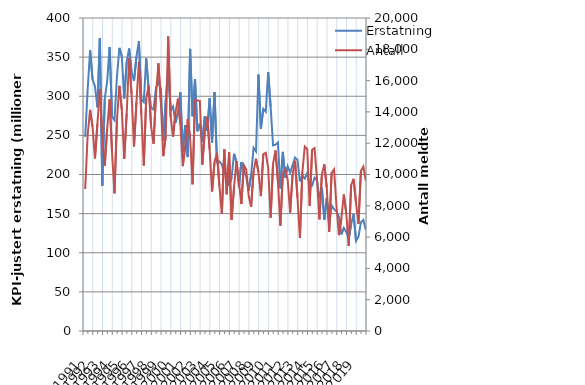
| Category | Erstatning |
|---|---|
| 1991.0 | 248.057 |
| nan | 308.627 |
| nan | 358.693 |
| nan | 321.26 |
| 1992.0 | 312.729 |
| nan | 285.747 |
| nan | 374.471 |
| nan | 185.723 |
| 1993.0 | 296.278 |
| nan | 319.228 |
| nan | 362.936 |
| nan | 274.046 |
| 1994.0 | 269.382 |
| nan | 324.361 |
| nan | 361.799 |
| nan | 351.005 |
| 1995.0 | 297.194 |
| nan | 343.799 |
| nan | 361.037 |
| nan | 330.603 |
| 1996.0 | 319.615 |
| nan | 350.864 |
| nan | 370.19 |
| nan | 295.958 |
| 1997.0 | 292.605 |
| nan | 348.509 |
| nan | 308.476 |
| nan | 285.174 |
| 1998.0 | 283.048 |
| nan | 310.499 |
| nan | 318.39 |
| nan | 309.824 |
| 1999.0 | 243.397 |
| nan | 295.338 |
| nan | 339.423 |
| nan | 281.522 |
| 2000.0 | 286.967 |
| nan | 266.129 |
| nan | 279.157 |
| nan | 305.187 |
| 2001.0 | 229.498 |
| nan | 263.225 |
| nan | 222.281 |
| nan | 360.521 |
| 2002.0 | 274.489 |
| nan | 321.805 |
| nan | 255.203 |
| nan | 264.959 |
| 2003.0 | 242.084 |
| nan | 274.311 |
| nan | 255.783 |
| nan | 297.411 |
| 2004.0 | 240.864 |
| nan | 305.339 |
| nan | 215.728 |
| nan | 216.628 |
| 2005.0 | 212.933 |
| nan | 200.686 |
| nan | 201.519 |
| nan | 185.579 |
| 2006.0 | 195.806 |
| nan | 226.436 |
| nan | 215.962 |
| nan | 183.576 |
| 2007.0 | 215.982 |
| nan | 206.32 |
| nan | 196.771 |
| nan | 179.209 |
| 2008.0 | 199.107 |
| nan | 234.11 |
| nan | 229.432 |
| nan | 327.757 |
| 2009.0 | 258.569 |
| nan | 283.783 |
| nan | 280.23 |
| nan | 330.981 |
| 2010.0 | 286.356 |
| nan | 237.103 |
| nan | 238.076 |
| nan | 240.915 |
| 2011.0 | 182.223 |
| nan | 228.904 |
| nan | 196.002 |
| nan | 210.385 |
| 2012.0 | 202.292 |
| nan | 212.041 |
| nan | 221.603 |
| nan | 218.691 |
| 2013.0 | 191.321 |
| nan | 198.861 |
| nan | 194.773 |
| nan | 201.798 |
| 2014.0 | 184.379 |
| nan | 185.559 |
| nan | 195.898 |
| nan | 192.849 |
| 2015.0 | 170.188 |
| nan | 183.367 |
| nan | 142.336 |
| nan | 169.636 |
| 2016.0 | 136.613 |
| nan | 160.335 |
| nan | 155.619 |
| nan | 152.804 |
| 2017.0 | 146.163 |
| nan | 123.364 |
| nan | 131.737 |
| nan | 126.674 |
| 2018.0 | 117.472 |
| nan | 136.337 |
| nan | 149.581 |
| nan | 115.015 |
| 2019.0 | 120.453 |
| nan | 138.789 |
| nan | 141.885 |
| nan | 129.36 |